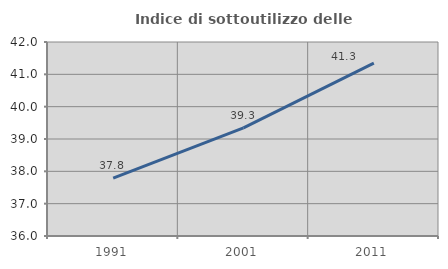
| Category | Indice di sottoutilizzo delle abitazioni  |
|---|---|
| 1991.0 | 37.79 |
| 2001.0 | 39.344 |
| 2011.0 | 41.346 |